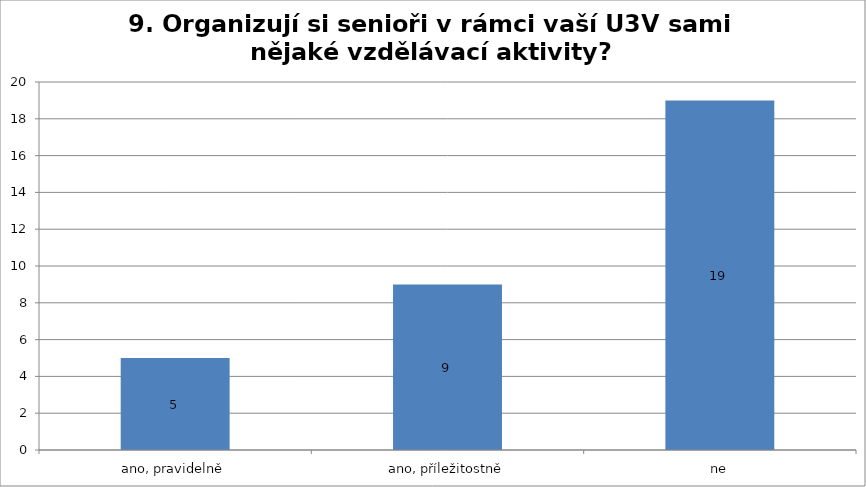
| Category | Series 0 |
|---|---|
| ano, pravidelně | 5 |
| ano, příležitostně | 9 |
| ne | 19 |